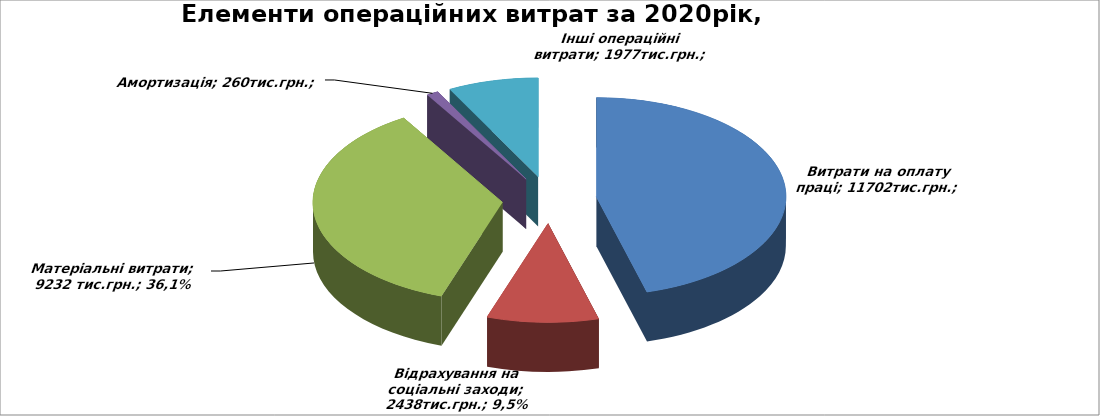
| Category | Series 0 |
|---|---|
| Витрати на оплату праці | 11702 |
| Відрахування на соціальні заходи | 2438 |
| Матеріальні витрати | 9232 |
| Амортизація | 260 |
| Інші операційні витрати | 1977 |